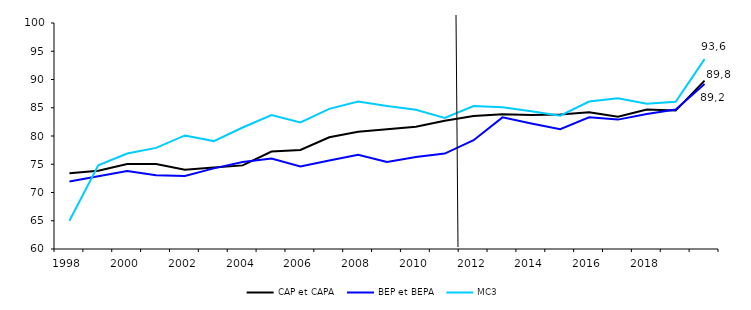
| Category | CAP et CAPA  | BEP et BEPA  | MC3 |
|---|---|---|---|
| 1998.0 | 73.402 | 71.949 | 65 |
| 1999.0 | 73.869 | 72.873 | 74.8 |
| 2000.0 | 75.049 | 73.797 | 76.9 |
| 2001.0 | 75.03 | 73.047 | 77.9 |
| 2002.0 | 74.009 | 72.923 | 80.1 |
| 2003.0 | 74.408 | 74.269 | 79.1 |
| 2004.0 | 74.799 | 75.39 | 81.5 |
| 2005.0 | 77.242 | 76.029 | 83.7 |
| 2006.0 | 77.539 | 74.614 | 82.4 |
| 2007.0 | 79.773 | 75.663 | 84.8 |
| 2008.0 | 80.734 | 76.696 | 86.1 |
| 2009.0 | 81.187 | 75.39 | 85.3 |
| 2010.0 | 81.622 | 76.295 | 84.636 |
| 2011.0 | 82.716 | 76.886 | 83.2 |
| 2012.0 | 83.548 | 79.261 | 85.3 |
| 2013.0 | 83.838 | 83.295 | 85.084 |
| 2014.0 | 83.7 | 82.2 | 84.4 |
| 2015.0 | 83.8 | 81.2 | 83.6 |
| 2016.0 | 84.2 | 83.3 | 86.1 |
| 2017.0 | 83.4 | 82.9 | 86.7 |
| 2018.0 | 84.7 | 83.9 | 85.7 |
| 2019.0 | 84.5 | 84.7 | 86.063 |